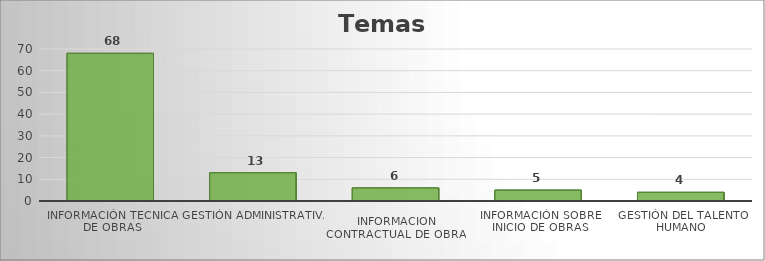
| Category | Series 0 |
|---|---|
| INFORMACIÓN TECNICA DE OBRAS | 68 |
| GESTIÓN ADMINISTRATIVA | 13 |
| INFORMACIÓN CONTRACTUAL DE OBRAS | 6 |
| INFORMACIÓN SOBRE INICIO DE OBRAS | 5 |
| GESTIÓN DEL TALENTO HUMANO | 4 |